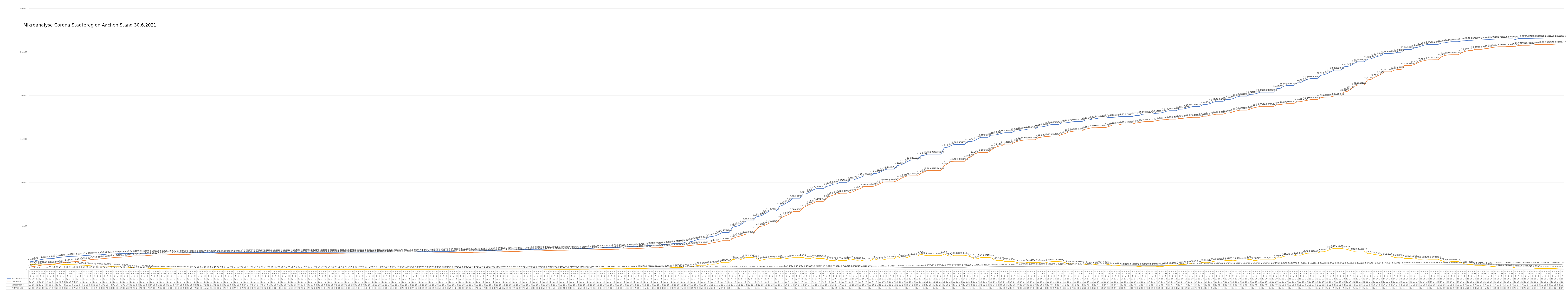
| Category | Positiv Getestete | Genesene | Verstorbene | Aktive Fälle |
|---|---|---|---|---|
| 3/31/20 | 922 | 322 | 15 | 585 |
| 4/1/20 | 980 | 364 | 16 | 600 |
| 4/2/20 | 1081 | 435 | 21 | 625 |
| 4/3/20 | 1155 | 494 | 27 | 634 |
| 4/4/20 | 1213 | 560 | 27 | 626 |
| 4/5/20 | 1259 | 578 | 27 | 654 |
| 4/6/20 | 1272 | 595 | 35 | 642 |
| 4/7/20 | 1295 | 662 | 35 | 598 |
| 4/8/20 | 1399 | 699 | 36 | 664 |
| 4/9/20 | 1426 | 755 | 41 | 630 |
| 4/10/20 | 1465 | 826 | 48 | 591 |
| 4/11/20 | 1508 | 854 | 50 | 604 |
| 4/12/20 | 1532 | 906 | 51 | 575 |
| 4/13/20 | 1547 | 922 | 51 | 574 |
| 4/14/20 | 1557 | 949 | 52 | 556 |
| 4/15/20 | 1583 | 1009 | 54 | 520 |
| 4/16/20 | 1623 | 1058 | 56 | 509 |
| 4/17/20 | 1650 | 1112 | 59 | 479 |
| 4/18/20 | 1669 | 1159 | 62 | 448 |
| 4/19/20 | 1693 | 1195 | 62 | 436 |
| 4/20/20 | 1707 | 1201 | 63 | 443 |
| 4/21/20 | 1719 | 1256 | 65 | 398 |
| 4/22/20 | 1754 | 1281 | 70 | 403 |
| 4/23/20 | 1797 | 1324 | 73 | 400 |
| 4/24/20 | 1812 | 1357 | 74 | 381 |
| 4/25/20 | 1824 | 1412 | 75 | 337 |
| 4/26/20 | 1835 | 1420 | 76 | 339 |
| 4/27/20 | 1839 | 1435 | 76 | 328 |
| 4/28/20 | 1845 | 1467 | 78 | 300 |
| 4/29/20 | 1853 | 1490 | 79 | 284 |
| 4/30/20 | 1866 | 1535 | 82 | 249 |
| 5/1/20 | 1891 | 1591 | 83 | 217 |
| 5/2/20 | 1891 | 1591 | 83 | 217 |
| 5/3/20 | 1891 | 1591 | 83 | 217 |
| 5/4/20 | 1885 | 1598 | 83 | 204 |
| 5/5/20 | 1890 | 1636 | 84 | 170 |
| 5/6/20 | 1895 | 1664 | 84 | 147 |
| 5/7/20 | 1903 | 1682 | 85 | 136 |
| 5/8/20 | 1909 | 1702 | 85 | 122 |
| 5/9/20 | 1909 | 1702 | 85 | 122 |
| 5/10/20 | 1909 | 1702 | 85 | 122 |
| 5/11/20 | 1924 | 1721 | 86 | 117 |
| 5/12/20 | 1929 | 1736 | 87 | 106 |
| 5/13/20 | 1934 | 1743 | 87 | 104 |
| 5/14/20 | 1941 | 1753 | 87 | 101 |
| 5/15/20 | 1945 | 1764 | 88 | 93 |
| 5/16/20 | 1945 | 1764 | 88 | 93 |
| 5/17/20 | 1945 | 1764 | 88 | 93 |
| 5/18/20 | 1951 | 1784 | 88 | 79 |
| 5/19/20 | 1952 | 1791 | 89 | 72 |
| 5/20/20 | 1958 | 1801 | 91 | 66 |
| 5/21/20 | 1960 | 1814 | 91 | 55 |
| 5/22/20 | 1960 | 1814 | 91 | 55 |
| 5/23/20 | 1960 | 1814 | 91 | 55 |
| 5/24/20 | 1960 | 1814 | 91 | 55 |
| 5/25/20 | 1960 | 1829 | 91 | 40 |
| 5/26/20 | 1960 | 1839 | 91 | 30 |
| 5/27/20 | 1962 | 1846 | 92 | 24 |
| 5/28/20 | 1964 | 1849 | 92 | 23 |
| 5/29/20 | 1967 | 1850 | 93 | 24 |
| 5/30/20 | 1967 | 1850 | 93 | 24 |
| 5/31/20 | 1967 | 1850 | 93 | 24 |
| 6/1/20 | 1967 | 1850 | 93 | 24 |
| 6/2/20 | 1971 | 1856 | 93 | 22 |
| 6/3/20 | 1972 | 1858 | 94 | 20 |
| 6/4/20 | 1975 | 1859 | 94 | 22 |
| 6/5/20 | 1976 | 1859 | 94 | 23 |
| 6/6/20 | 1976 | 1859 | 94 | 23 |
| 6/7/20 | 1976 | 1859 | 94 | 23 |
| 6/8/20 | 1979 | 1862 | 94 | 23 |
| 6/9/20 | 1979 | 1863 | 94 | 22 |
| 6/10/20 | 1980 | 1865 | 95 | 20 |
| 6/11/20 | 1982 | 1869 | 95 | 18 |
| 6/12/20 | 1982 | 1869 | 95 | 18 |
| 6/13/20 | 1982 | 1869 | 95 | 18 |
| 6/14/20 | 1982 | 1869 | 95 | 18 |
| 6/15/20 | 1982 | 1871 | 95 | 16 |
| 6/16/20 | 1982 | 1871 | 95 | 16 |
| 6/17/20 | 1985 | 1871 | 95 | 19 |
| 6/18/20 | 1985 | 1871 | 95 | 19 |
| 6/19/20 | 1991 | 1873 | 97 | 21 |
| 6/20/20 | 1991 | 1873 | 97 | 21 |
| 6/21/20 | 1991 | 1873 | 97 | 21 |
| 6/22/20 | 1994 | 1875 | 97 | 22 |
| 6/23/20 | 1994 | 1875 | 97 | 22 |
| 6/24/20 | 1997 | 1876 | 98 | 23 |
| 6/25/20 | 1999 | 1880 | 98 | 21 |
| 6/26/20 | 1999 | 1880 | 98 | 21 |
| 6/27/20 | 1999 | 1880 | 98 | 21 |
| 6/28/20 | 1999 | 1880 | 98 | 21 |
| 6/29/20 | 2001 | 1883 | 98 | 20 |
| 6/30/20 | 2001 | 1883 | 98 | 20 |
| 7/1/20 | 2004 | 1890 | 98 | 16 |
| 7/2/20 | 2004 | 1890 | 98 | 16 |
| 7/3/20 | 2009 | 1898 | 98 | 13 |
| 7/4/20 | 2009 | 1898 | 98 | 13 |
| 7/5/20 | 2009 | 1898 | 98 | 13 |
| 7/6/20 | 2010 | 1900 | 98 | 12 |
| 7/7/20 | 2010 | 1900 | 99 | 11 |
| 7/8/20 | 2010 | 1900 | 99 | 11 |
| 7/9/20 | 2010 | 1900 | 99 | 11 |
| 7/10/20 | 2011 | 1908 | 100 | 3 |
| 7/11/20 | 2011 | 1908 | 100 | 3 |
| 7/12/20 | 2011 | 1908 | 100 | 3 |
| 7/13/20 | 2021 | 1908 | 100 | 13 |
| 7/14/20 | 2021 | 1908 | 100 | 13 |
| 7/15/20 | 2025 | 1909 | 100 | 16 |
| 7/16/20 | 2025 | 1909 | 100 | 16 |
| 7/17/20 | 2030 | 1917 | 100 | 13 |
| 7/18/20 | 2030 | 1917 | 100 | 13 |
| 7/19/20 | 2030 | 1917 | 100 | 13 |
| 7/20/20 | 2037 | 1917 | 100 | 20 |
| 7/21/20 | 2037 | 1917 | 100 | 20 |
| 7/22/20 | 2044 | 1920 | 100 | 24 |
| 7/23/20 | 2044 | 1920 | 100 | 24 |
| 7/24/20 | 2058 | 1922 | 100 | 36 |
| 7/25/20 | 2067 | 1928 | 100 | 39 |
| 7/26/20 | 2067 | 1928 | 100 | 39 |
| 7/27/20 | 2067 | 1928 | 100 | 39 |
| 7/28/20 | 2067 | 1928 | 100 | 39 |
| 7/29/20 | 2076 | 1937 | 100 | 39 |
| 7/30/20 | 2095 | 1942 | 100 | 53 |
| 7/31/20 | 2095 | 1942 | 100 | 53 |
| 8/1/20 | 2095 | 1942 | 100 | 53 |
| 8/2/20 | 2095 | 1942 | 100 | 53 |
| 8/3/20 | 2108 | 1954 | 100 | 54 |
| 8/4/20 | 2108 | 1954 | 100 | 54 |
| 8/5/20 | 2139 | 1958 | 100 | 81 |
| 8/6/20 | 2139 | 1958 | 100 | 81 |
| 8/7/20 | 2157 | 1975 | 100 | 82 |
| 8/8/20 | 2157 | 1975 | 100 | 82 |
| 8/9/20 | 2157 | 1975 | 100 | 82 |
| 8/10/20 | 2170 | 1999 | 100 | 71 |
| 8/11/20 | 2170 | 1999 | 100 | 71 |
| 8/12/20 | 2181 | 2008 | 101 | 72 |
| 8/13/20 | 2181 | 2008 | 101 | 72 |
| 8/14/20 | 2212 | 2028 | 101 | 83 |
| 8/15/20 | 2212 | 2028 | 101 | 83 |
| 8/16/20 | 2212 | 2028 | 101 | 83 |
| 8/17/20 | 2232 | 2053 | 101 | 78 |
| 8/18/20 | 2232 | 2053 | 101 | 78 |
| 8/19/20 | 2261 | 2074 | 102 | 85 |
| 8/20/20 | 2261 | 2074 | 102 | 85 |
| 8/21/20 | 2281 | 2087 | 102 | 92 |
| 8/22/20 | 2281 | 2087 | 102 | 92 |
| 8/23/20 | 2281 | 2087 | 102 | 92 |
| 8/24/20 | 2311 | 2120 | 102 | 89 |
| 8/25/20 | 2324 | 2149 | 102 | 73 |
| 8/26/20 | 2324 | 2149 | 102 | 73 |
| 8/27/20 | 2324 | 2149 | 102 | 73 |
| 8/28/20 | 2348 | 2163 | 102 | 83 |
| 8/29/20 | 2348 | 2163 | 102 | 83 |
| 8/30/20 | 2348 | 2163 | 102 | 83 |
| 8/31/20 | 2353 | 2193 | 102 | 58 |
| 9/1/20 | 2363 | 2203 | 103 | 57 |
| 9/2/20 | 2370 | 2216 | 103 | 51 |
| 9/3/20 | 2378 | 2224 | 103 | 51 |
| 9/4/20 | 2384 | 2235 | 103 | 46 |
| 9/5/20 | 2384 | 2235 | 103 | 46 |
| 9/6/20 | 2384 | 2235 | 103 | 46 |
| 9/7/20 | 2389 | 2247 | 103 | 39 |
| 9/8/20 | 2393 | 2258 | 103 | 32 |
| 9/9/20 | 2400 | 2260 | 103 | 37 |
| 9/10/20 | 2412 | 2263 | 103 | 46 |
| 9/11/20 | 2429 | 2271 | 103 | 55 |
| 9/12/20 | 2429 | 2271 | 103 | 55 |
| 9/13/20 | 2429 | 2271 | 103 | 55 |
| 9/14/20 | 2459 | 2283 | 103 | 73 |
| 9/15/20 | 2477 | 2288 | 103 | 86 |
| 9/16/20 | 2503 | 2297 | 103 | 103 |
| 9/17/20 | 2522 | 2309 | 103 | 110 |
| 9/18/20 | 2550 | 2326 | 103 | 121 |
| 9/19/20 | 2550 | 2326 | 103 | 121 |
| 9/20/20 | 2550 | 2326 | 103 | 121 |
| 9/21/20 | 2568 | 2350 | 104 | 114 |
| 9/22/20 | 2568 | 2350 | 104 | 114 |
| 9/23/20 | 2600 | 2387 | 104 | 109 |
| 9/24/20 | 2621 | 2398 | 104 | 119 |
| 9/25/20 | 2643 | 2415 | 104 | 124 |
| 9/26/20 | 2643 | 2415 | 104 | 124 |
| 9/27/20 | 2643 | 2415 | 104 | 124 |
| 9/28/20 | 2707 | 2442 | 105 | 160 |
| 9/29/20 | 2718 | 2464 | 105 | 149 |
| 9/30/20 | 2734 | 2476 | 106 | 152 |
| 10/1/20 | 2776 | 2495 | 106 | 175 |
| 10/2/20 | 2812 | 2524 | 106 | 182 |
| 10/3/20 | 2812 | 2524 | 106 | 182 |
| 10/4/20 | 2812 | 2524 | 106 | 182 |
| 10/5/20 | 2883 | 2571 | 106 | 206 |
| 10/6/20 | 2891 | 2601 | 107 | 183 |
| 10/7/20 | 2936 | 2617 | 107 | 212 |
| 10/8/20 | 2988 | 2638 | 107 | 243 |
| 10/9/20 | 3027 | 2664 | 109 | 254 |
| 10/10/20 | 3027 | 2664 | 109 | 254 |
| 10/11/20 | 3027 | 2664 | 109 | 254 |
| 10/12/20 | 3167 | 2723 | 109 | 335 |
| 10/13/20 | 3188 | 2772 | 109 | 307 |
| 10/14/20 | 3257 | 2806 | 109 | 342 |
| 10/15/20 | 3393 | 2845 | 109 | 439 |
| 10/16/20 | 3509 | 2891 | 109 | 509 |
| 10/17/20 | 3509 | 2891 | 109 | 509 |
| 10/18/20 | 3509 | 2891 | 109 | 509 |
| 10/19/20 | 3778 | 3016 | 110 | 652 |
| 10/20/20 | 3816 | 3084 | 110 | 622 |
| 10/21/20 | 3912 | 3157 | 110 | 645 |
| 10/22/20 | 4103 | 3237 | 111 | 755 |
| 10/23/20 | 4288 | 3330 | 111 | 847 |
| 10/24/20 | 4288 | 3330 | 111 | 847 |
| 10/25/20 | 4288 | 3330 | 111 | 847 |
| 10/26/20 | 4889 | 3574 | 111 | 1204 |
| 10/27/20 | 4969 | 3734 | 116 | 1119 |
| 10/28/20 | 5082 | 3840 | 119 | 1123 |
| 10/29/20 | 5316 | 3953 | 122 | 1241 |
| 10/30/20 | 5612 | 4093 | 124 | 1395 |
| 10/31/20 | 5612 | 4093 | 124 | 1395 |
| 11/1/20 | 5612 | 4093 | 124 | 1395 |
| 11/2/20 | 6061 | 4610 | 125 | 1326 |
| 11/3/20 | 6153 | 4966 | 129 | 1058 |
| 11/4/20 | 6278 | 5013 | 130 | 1135 |
| 11/5/20 | 6519 | 5166 | 130 | 1223 |
| 11/6/20 | 6748 | 5360 | 132 | 1256 |
| 11/7/20 | 6748 | 5360 | 132 | 1256 |
| 11/8/20 | 6748 | 5360 | 132 | 1256 |
| 11/9/20 | 7273 | 5831 | 132 | 1310 |
| 11/10/20 | 7426 | 6076 | 140 | 1210 |
| 11/11/20 | 7658 | 6237 | 142 | 1279 |
| 11/12/20 | 7871 | 6394 | 143 | 1334 |
| 11/13/20 | 8211 | 6683 | 143 | 1385 |
| 11/14/20 | 8211 | 6683 | 143 | 1385 |
| 11/15/20 | 8211 | 6683 | 143 | 1385 |
| 11/16/20 | 8681 | 7124 | 143 | 1414 |
| 11/17/20 | 8728 | 7322 | 148 | 1258 |
| 11/18/20 | 8920 | 7498 | 148 | 1274 |
| 11/19/20 | 9179 | 7631 | 156 | 1392 |
| 11/20/20 | 9311 | 7849 | 162 | 1300 |
| 11/21/20 | 9311 | 7849 | 162 | 1300 |
| 11/22/20 | 9311 | 7849 | 162 | 1300 |
| 11/23/20 | 9565 | 8230 | 164 | 1171 |
| 11/24/20 | 9676 | 8447 | 168 | 1061 |
| 11/25/20 | 9827 | 8576 | 172 | 1079 |
| 11/26/20 | 9867 | 8698 | 175 | 994 |
| 11/27/20 | 10038 | 8786 | 178 | 1074 |
| 11/28/20 | 10038 | 8786 | 178 | 1074 |
| 11/29/20 | 10038 | 8786 | 178 | 1074 |
| 11/30/20 | 10289 | 8868 | 182 | 1239 |
| 12/1/20 | 10316 | 8968 | 184 | 1164 |
| 12/2/20 | 10460 | 9194 | 188 | 1078 |
| 12/3/20 | 10605 | 9314 | 191 | 1100 |
| 12/4/20 | 10764 | 9548 | 196 | 1020 |
| 12/5/20 | 10764 | 9548 | 196 | 1020 |
| 12/6/20 | 10764 | 9548 | 196 | 1020 |
| 12/7/20 | 11053 | 9586 | 197 | 1270 |
| 12/8/20 | 11080 | 9730 | 211 | 1139 |
| 12/9/20 | 11222 | 9915 | 213 | 1094 |
| 12/10/20 | 11442 | 10086 | 213 | 1143 |
| 12/11/20 | 11557 | 10095 | 214 | 1248 |
| 12/12/20 | 11557 | 10095 | 214 | 1248 |
| 12/13/20 | 11557 | 10095 | 214 | 1248 |
| 12/14/20 | 11970 | 10237 | 219 | 1514 |
| 12/15/20 | 12025 | 10461 | 219 | 1345 |
| 12/16/20 | 12197 | 10640 | 232 | 1325 |
| 12/17/20 | 12415 | 10773 | 240 | 1402 |
| 12/18/20 | 12592 | 10783 | 242 | 1567 |
| 12/19/20 | 12592 | 10783 | 242 | 1567 |
| 12/20/20 | 12592 | 10783 | 242 | 1567 |
| 12/21/20 | 13089 | 11054 | 246 | 1789 |
| 12/22/20 | 13144 | 11232 | 246 | 1666 |
| 12/23/20 | 13276 | 11409 | 256 | 1611 |
| 12/24/20 | 13276 | 11409 | 256 | 1611 |
| 12/25/20 | 13276 | 11409 | 256 | 1611 |
| 12/26/20 | 13276 | 11409 | 256 | 1611 |
| 12/27/20 | 13276 | 11409 | 256 | 1611 |
| 12/28/20 | 14012 | 11950 | 263 | 1799 |
| 12/29/20 | 14078 | 12189 | 265 | 1624 |
| 12/30/20 | 14248 | 12435 | 272 | 1541 |
| 12/31/20 | 14395 | 12460 | 276 | 1659 |
| 1/1/21 | 14395 | 12460 | 276 | 1659 |
| 1/2/21 | 14395 | 12460 | 276 | 1659 |
| 1/3/21 | 14395 | 12460 | 276 | 1659 |
| 1/4/21 | 14721 | 12848 | 292 | 1581 |
| 1/5/21 | 14723 | 12949 | 301 | 1473 |
| 1/6/21 | 14832 | 13293 | 310 | 1229 |
| 1/7/21 | 15028 | 13437 | 319 | 1272 |
| 1/8/21 | 15211 | 13473 | 325 | 1413 |
| 1/9/21 | 15211 | 13473 | 325 | 1413 |
| 1/10/21 | 15211 | 13473 | 325 | 1413 |
| 1/11/21 | 15460 | 13759 | 335 | 1366 |
| 1/12/21 | 15469 | 14015 | 340 | 1114 |
| 1/13/21 | 15548 | 14173 | 347 | 1028 |
| 1/14/21 | 15657 | 14233 | 347 | 1077 |
| 1/15/21 | 15745 | 14431 | 359 | 955 |
| 1/16/21 | 15745 | 14431 | 359 | 955 |
| 1/17/21 | 15745 | 14431 | 359 | 955 |
| 1/18/21 | 15931 | 14657 | 362 | 912 |
| 1/19/21 | 15933 | 14772 | 370 | 791 |
| 1/20/21 | 16037 | 14857 | 380 | 800 |
| 1/21/21 | 16081 | 14908 | 390 | 783 |
| 1/22/21 | 16164 | 14930 | 393 | 841 |
| 1/23/21 | 16164 | 14930 | 393 | 841 |
| 1/24/21 | 16164 | 14930 | 393 | 841 |
| 1/25/21 | 16399 | 15168 | 393 | 838 |
| 1/26/21 | 16415 | 15229 | 398 | 788 |
| 1/27/21 | 16478 | 15299 | 399 | 780 |
| 1/28/21 | 16602 | 15315 | 399 | 888 |
| 1/29/21 | 16688 | 15360 | 405 | 923 |
| 1/30/21 | 16688 | 15360 | 405 | 923 |
| 1/31/21 | 16688 | 15360 | 405 | 923 |
| 2/1/21 | 16866 | 15540 | 416 | 910 |
| 2/2/21 | 16871 | 15644 | 417 | 810 |
| 2/3/21 | 16914 | 15817 | 420 | 677 |
| 2/4/21 | 16984 | 15886 | 420 | 678 |
| 2/5/21 | 17029 | 15937 | 427 | 665 |
| 2/6/21 | 17029 | 15937 | 427 | 665 |
| 2/7/21 | 17029 | 15937 | 427 | 665 |
| 2/8/21 | 17191 | 16150 | 430 | 611 |
| 2/9/21 | 17198 | 16225 | 435 | 538 |
| 2/10/21 | 17301 | 16316 | 437 | 548 |
| 2/11/21 | 17352 | 16314 | 437 | 601 |
| 2/12/21 | 17416 | 16328 | 443 | 645 |
| 2/13/21 | 17416 | 16328 | 443 | 645 |
| 2/14/21 | 17416 | 16328 | 443 | 645 |
| 2/15/21 | 17499 | 16463 | 447 | 589 |
| 2/16/21 | 17502 | 16612 | 447 | 443 |
| 2/17/21 | 17530 | 16635 | 448 | 447 |
| 2/18/21 | 17582 | 16651 | 448 | 483 |
| 2/19/21 | 17611 | 16744 | 455 | 412 |
| 2/20/21 | 17611 | 16744 | 455 | 412 |
| 2/21/21 | 17611 | 16744 | 455 | 412 |
| 2/22/21 | 17611 | 16744 | 455 | 412 |
| 2/23/21 | 17720 | 16859 | 455 | 406 |
| 2/24/21 | 17722 | 16899 | 457 | 366 |
| 2/25/21 | 17858 | 16987 | 465 | 406 |
| 2/26/21 | 17896 | 17033 | 465 | 398 |
| 2/27/21 | 17896 | 17033 | 465 | 398 |
| 2/28/21 | 17896 | 17033 | 465 | 398 |
| 3/1/21 | 17971 | 17110 | 466 | 395 |
| 3/2/21 | 17984 | 17178 | 466 | 340 |
| 3/3/21 | 18062 | 17228 | 468 | 366 |
| 3/4/21 | 18194 | 17244 | 470 | 480 |
| 3/5/21 | 18266 | 17295 | 470 | 501 |
| 3/6/21 | 18266 | 17295 | 470 | 501 |
| 3/7/21 | 18266 | 17295 | 470 | 501 |
| 3/8/21 | 18445 | 17383 | 473 | 589 |
| 3/9/21 | 18451 | 17388 | 474 | 589 |
| 3/10/21 | 18548 | 17451 | 474 | 623 |
| 3/11/21 | 18651 | 17493 | 475 | 683 |
| 3/12/21 | 18747 | 17508 | 476 | 763 |
| 3/13/21 | 18747 | 17508 | 476 | 763 |
| 3/14/21 | 18747 | 17508 | 476 | 763 |
| 3/15/21 | 18967 | 17633 | 479 | 855 |
| 3/16/21 | 18970 | 17638 | 481 | 851 |
| 3/17/21 | 19075 | 17749 | 482 | 844 |
| 3/18/21 | 19232 | 17800 | 482 | 950 |
| 3/19/21 | 19348 | 17864 | 484 | 1000 |
| 3/20/21 | 19348 | 17864 | 484 | 1000 |
| 3/21/21 | 19348 | 17864 | 484 | 1000 |
| 3/22/21 | 19559 | 18009 | 486 | 1064 |
| 3/23/21 | 19563 | 18017 | 489 | 1057 |
| 3/24/21 | 19663 | 18151 | 490 | 1022 |
| 3/25/21 | 19832 | 18252 | 491 | 1089 |
| 3/26/21 | 19939 | 18325 | 493 | 1121 |
| 3/27/21 | 19939 | 18325 | 493 | 1121 |
| 3/28/21 | 19939 | 18325 | 493 | 1121 |
| 3/29/21 | 20141 | 18444 | 493 | 1204 |
| 3/30/21 | 20162 | 18593 | 495 | 1074 |
| 3/31/21 | 20247 | 18675 | 495 | 1077 |
| 4/1/21 | 20398 | 18766 | 495 | 1137 |
| 4/2/21 | 20398 | 18766 | 495 | 1137 |
| 4/3/21 | 20398 | 18766 | 495 | 1137 |
| 4/4/21 | 20398 | 18766 | 495 | 1137 |
| 4/5/21 | 20398 | 18766 | 495 | 1137 |
| 4/6/21 | 20818 | 18950 | 499 | 1369 |
| 4/7/21 | 20835 | 18974 | 499 | 1362 |
| 4/8/21 | 21070 | 19035 | 504 | 1531 |
| 4/9/21 | 21163 | 19079 | 505 | 1579 |
| 4/10/21 | 21163 | 19079 | 505 | 1579 |
| 4/11/21 | 21163 | 19079 | 505 | 1579 |
| 4/12/21 | 21473 | 19285 | 505 | 1683 |
| 4/13/21 | 21482 | 19309 | 510 | 1663 |
| 4/14/21 | 21688 | 19390 | 515 | 1783 |
| 4/15/21 | 21861 | 19457 | 516 | 1888 |
| 4/16/21 | 21963 | 19544 | 518 | 1901 |
| 4/17/21 | 21963 | 19544 | 518 | 1901 |
| 4/18/21 | 21963 | 19544 | 518 | 1901 |
| 4/19/21 | 22329 | 19753 | 523 | 2053 |
| 4/20/21 | 22407 | 19820 | 523 | 2064 |
| 4/21/21 | 22536 | 19838 | 523 | 2175 |
| 4/22/21 | 22736 | 19860 | 524 | 2352 |
| 4/23/21 | 22926 | 19951 | 524 | 2451 |
| 4/24/21 | 22926 | 19951 | 524 | 2451 |
| 4/25/21 | 22926 | 19951 | 524 | 2451 |
| 4/26/21 | 23325 | 20410 | 525 | 2390 |
| 4/27/21 | 23349 | 20496 | 525 | 2328 |
| 4/28/21 | 23454 | 20743 | 528 | 2183 |
| 4/29/21 | 23708 | 21070 | 531 | 2107 |
| 4/30/21 | 23886 | 21205 | 532 | 2149 |
| 5/1/21 | 23887 | 21206 | 532 | 2149 |
| 5/2/21 | 23888 | 21207 | 532 | 2149 |
| 5/3/21 | 24183 | 21817 | 534 | 1832 |
| 5/4/21 | 24236 | 21855 | 538 | 1843 |
| 5/5/21 | 24385 | 22099 | 541 | 1745 |
| 5/6/21 | 24512 | 22268 | 543 | 1701 |
| 5/7/21 | 24611 | 22456 | 543 | 1612 |
| 5/8/21 | 24849 | 22741 | 547 | 1561 |
| 5/9/21 | 24849 | 22741 | 547 | 1561 |
| 5/10/21 | 24849 | 22741 | 547 | 1561 |
| 5/11/21 | 24885 | 22930 | 549 | 1406 |
| 5/12/21 | 24988 | 23004 | 549 | 1435 |
| 5/13/21 | 24988 | 23004 | 549 | 1435 |
| 5/14/21 | 25306 | 23458 | 554 | 1294 |
| 5/15/21 | 25307 | 23459 | 554 | 1294 |
| 5/16/21 | 25308 | 23460 | 554 | 1294 |
| 5/17/21 | 25503 | 23595 | 557 | 1351 |
| 5/18/21 | 25559 | 23799 | 560 | 1200 |
| 5/19/21 | 25704 | 23943 | 560 | 1201 |
| 5/20/21 | 25820 | 24030 | 560 | 1230 |
| 5/21/21 | 25884 | 24122 | 562 | 1200 |
| 5/22/21 | 25885 | 24123 | 562 | 1200 |
| 5/23/21 | 25886 | 24124 | 562 | 1200 |
| 5/24/21 | 25887 | 24125 | 562 | 1200 |
| 5/25/21 | 26059 | 24464 | 562 | 1033 |
| 5/26/21 | 26077 | 24616 | 565 | 896 |
| 5/27/21 | 26143 | 24685 | 568 | 890 |
| 5/28/21 | 26200 | 24704 | 568 | 928 |
| 5/29/21 | 26201 | 24705 | 568 | 928 |
| 5/30/21 | 26202 | 24706 | 568 | 928 |
| 5/31/21 | 26290 | 24913 | 570 | 807 |
| 6/1/21 | 26311 | 25083 | 570 | 658 |
| 6/2/21 | 26355 | 25174 | 571 | 610 |
| 6/3/21 | 26356 | 25175 | 571 | 610 |
| 6/4/21 | 26400 | 25321 | 574 | 505 |
| 6/5/21 | 26401 | 25322 | 574 | 505 |
| 6/6/21 | 26402 | 25323 | 574 | 505 |
| 6/7/21 | 26428 | 25401 | 575 | 452 |
| 6/8/21 | 26438 | 25438 | 576 | 424 |
| 6/9/21 | 26478 | 25528 | 577 | 373 |
| 6/10/21 | 26495 | 25577 | 577 | 341 |
| 6/11/21 | 26501 | 25623 | 577 | 301 |
| 6/12/21 | 26501 | 25623 | 577 | 301 |
| 6/13/21 | 26501 | 25623 | 577 | 301 |
| 6/14/21 | 26524 | 25654 | 578 | 292 |
| 6/15/21 | 26534 | 25654 | 578 | 302 |
| 6/16/21 | 26454 | 25669 | 579 | 206 |
| 6/17/21 | 26566 | 25777 | 579 | 210 |
| 6/18/21 | 26575 | 25790 | 579 | 206 |
| 6/19/21 | 26576 | 25791 | 579 | 206 |
| 6/20/21 | 26577 | 25792 | 579 | 206 |
| 6/21/21 | 26591 | 25815 | 580 | 196 |
| 6/22/21 | 26599 | 25863 | 580 | 156 |
| 6/23/21 | 26600 | 25874 | 581 | 145 |
| 6/24/21 | 26603 | 25882 | 581 | 140 |
| 6/25/21 | 26610 | 25895 | 582 | 133 |
| 6/26/21 | 26611 | 25896 | 582 | 133 |
| 6/27/21 | 26612 | 25897 | 582 | 133 |
| 6/28/21 | 26620 | 25914 | 583 | 123 |
| 6/29/21 | 26620 | 25936 | 584 | 100 |
| 6/30/21 | 26626 | 25947 | 585 | 94 |